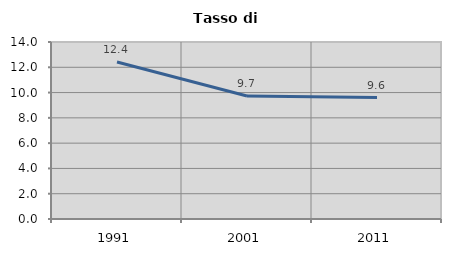
| Category | Tasso di disoccupazione   |
|---|---|
| 1991.0 | 12.417 |
| 2001.0 | 9.735 |
| 2011.0 | 9.601 |